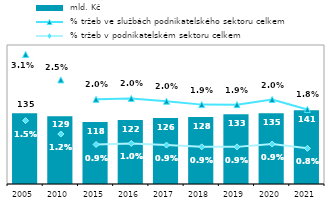
| Category |  mld. Kč  |
|---|---|
| 2005.0 | 134.976 |
| 2010.0 | 129.105 |
| 2015.0 | 118.336 |
| 2016.0 | 121.884 |
| 2017.0 | 125.872 |
| 2018.0 | 127.568 |
| 2019.0 | 132.752 |
| 2020.0 | 134.726 |
| 2021.0 | 140.786 |